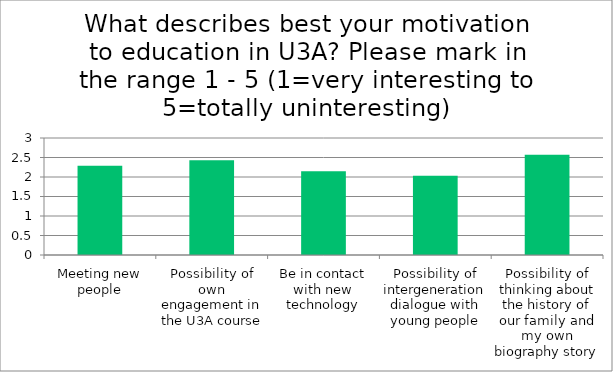
| Category | Weighted Average |
|---|---|
| Meeting new people | 2.29 |
| Possibility of own engagement in the U3A course | 2.43 |
| Be in contact with new technology | 2.15 |
| Possibility of intergeneration dialogue with young people | 2.03 |
| Possibility of thinking about the history of our family and my own biography story | 2.57 |